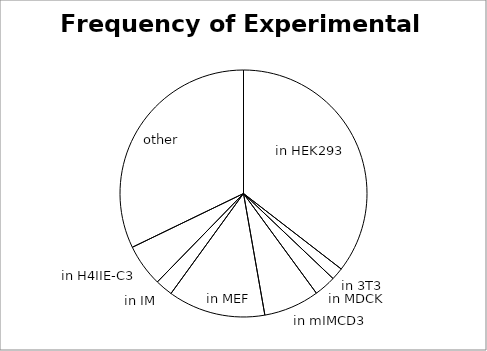
| Category | Series 0 |
|---|---|
| in HEK293 | 570 |
| in 3T3 | 26 |
| in MDCK | 46 |
| in mIMCD3 | 117 |
| in MEF | 205 |
| in IM | 37 |
| in H4IIE-C3 | 89 |
| other | 517 |